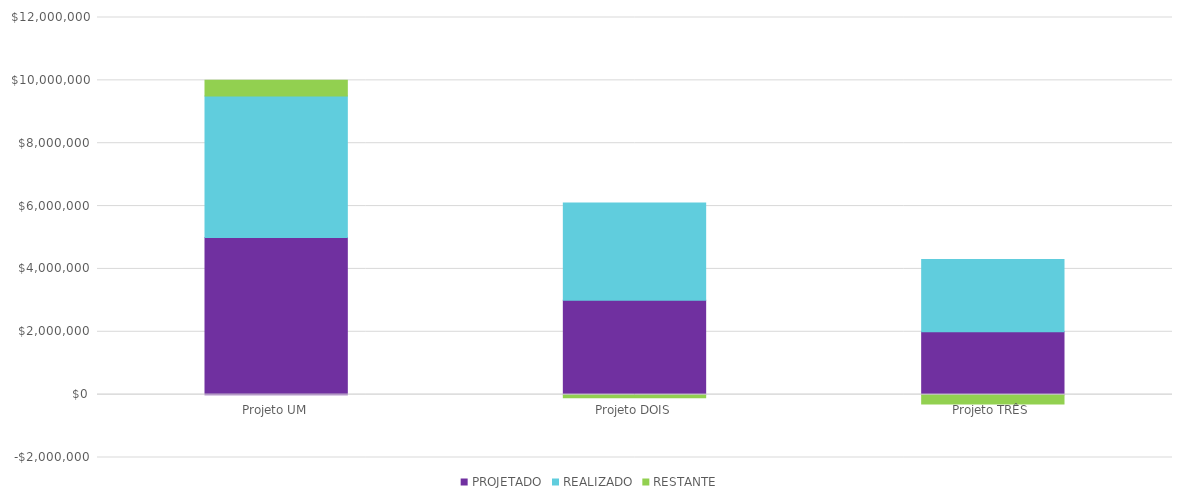
| Category | PROJETADO | REALIZADO | RESTANTE |
|---|---|---|---|
| Projeto UM | 5000000 | 4500000 | 500000 |
| Projeto DOIS | 3000000 | 3100000 | -100000 |
| Projeto TRÊS | 2000000 | 2300000 | -300000 |